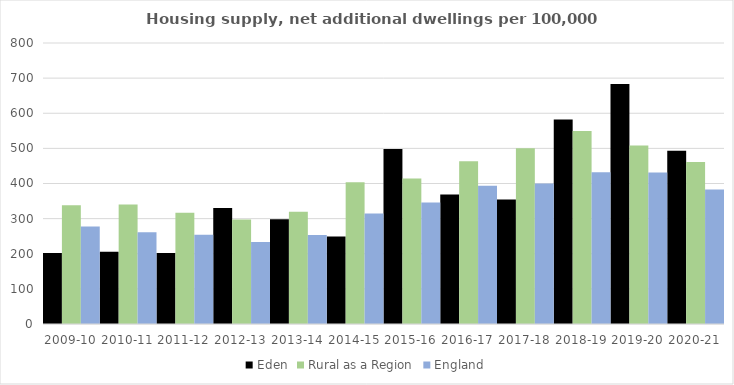
| Category | Eden | Rural as a Region | England |
|---|---|---|---|
| 2009-10 | 202.491 | 337.852 | 277.548 |
| 2010-11 | 205.968 | 340.105 | 260.994 |
| 2011-12 | 201.897 | 317.04 | 254.007 |
| 2012-13 | 330.252 | 297.763 | 233.153 |
| 2013-14 | 298.156 | 319.835 | 253.602 |
| 2014-15 | 248.818 | 403.796 | 314.256 |
| 2015-16 | 498.326 | 414.091 | 346.154 |
| 2016-17 | 368.527 | 463.209 | 393.256 |
| 2017-18 | 354.308 | 500.68 | 399.646 |
| 2018-19 | 582.44 | 549.491 | 432.099 |
| 2019-20 | 683.53 | 508.493 | 431.187 |
| 2020-21 | 492.987 | 461.114 | 382.827 |